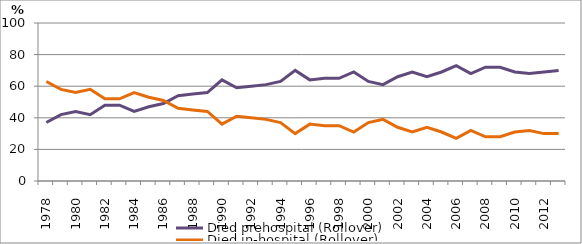
| Category | Died prehospital (Rollover) | Died in-hospital (Rollover) |
|---|---|---|
| 1978.0 | 37 | 63 |
| 1979.0 | 42 | 58 |
| 1980.0 | 44 | 56 |
| 1981.0 | 42 | 58 |
| 1982.0 | 48 | 52 |
| 1983.0 | 48 | 52 |
| 1984.0 | 44 | 56 |
| 1985.0 | 47 | 53 |
| 1986.0 | 49 | 51 |
| 1987.0 | 54 | 46 |
| 1988.0 | 55 | 45 |
| 1989.0 | 56 | 44 |
| 1990.0 | 64 | 36 |
| 1991.0 | 59 | 41 |
| 1992.0 | 60 | 40 |
| 1993.0 | 61 | 39 |
| 1994.0 | 63 | 37 |
| 1995.0 | 70 | 30 |
| 1996.0 | 64 | 36 |
| 1997.0 | 65 | 35 |
| 1998.0 | 65 | 35 |
| 1999.0 | 69 | 31 |
| 2000.0 | 63 | 37 |
| 2001.0 | 61 | 39 |
| 2002.0 | 66 | 34 |
| 2003.0 | 69 | 31 |
| 2004.0 | 66 | 34 |
| 2005.0 | 69 | 31 |
| 2006.0 | 73 | 27 |
| 2007.0 | 68 | 32 |
| 2008.0 | 72 | 28 |
| 2009.0 | 72 | 28 |
| 2010.0 | 69 | 31 |
| 2011.0 | 68 | 32 |
| 2012.0 | 69 | 30 |
| 2013.0 | 70 | 30 |